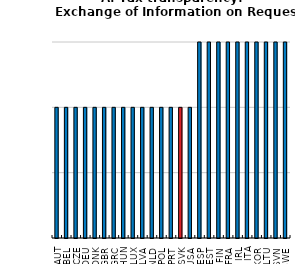
| Category | Series 0 |
|---|---|
| AUT | 4 |
| BEL | 4 |
| CZE | 4 |
| DEU | 4 |
| DNK | 4 |
| GBR | 4 |
| GRC | 4 |
| HUN | 4 |
| LUX | 4 |
| LVA | 4 |
| NLD | 4 |
| POL | 4 |
| PRT | 4 |
| SVK | 4 |
| USA | 4 |
| ESP | 6 |
| EST | 6 |
| FIN | 6 |
| FRA | 6 |
| IRL | 6 |
| ITA | 6 |
| KOR | 6 |
| LTU | 6 |
| SVN | 6 |
| SWE | 6 |